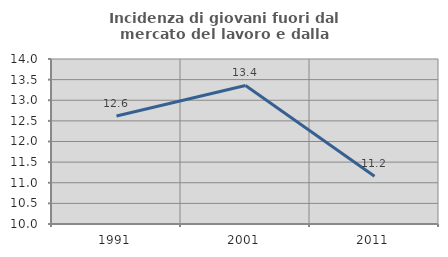
| Category | Incidenza di giovani fuori dal mercato del lavoro e dalla formazione  |
|---|---|
| 1991.0 | 12.618 |
| 2001.0 | 13.359 |
| 2011.0 | 11.157 |